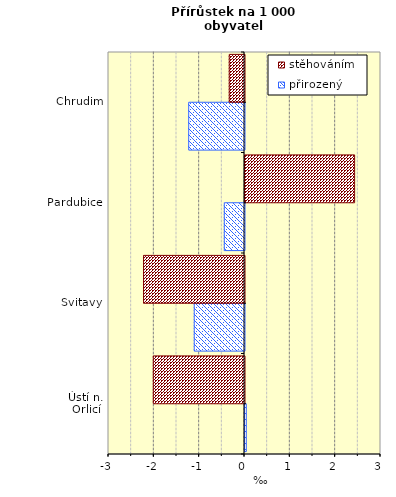
| Category | přirozený | stěhováním |
|---|---|---|
| Ústí n. Orlicí | 0.029 | -2.011 |
| Svitavy | -1.108 | -2.226 |
| Pardubice | -0.446 | 2.418 |
| Chrudim | -1.231 | -0.336 |